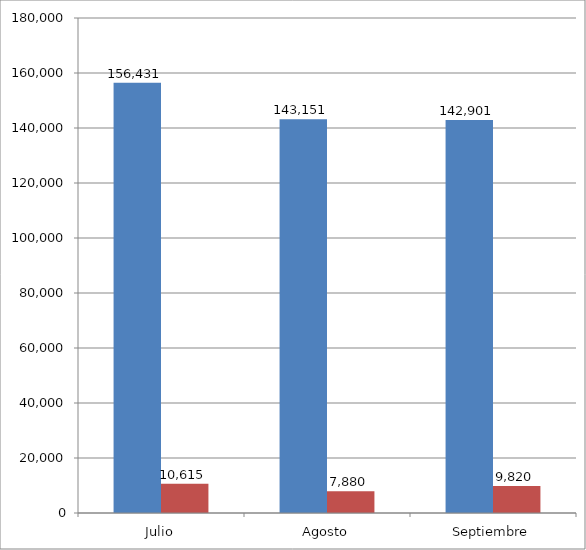
| Category | Series 0 | Series 1 |
|---|---|---|
| Julio | 156431 | 10615 |
| Agosto | 143151 | 7880 |
| Septiembre | 142901 | 9820 |